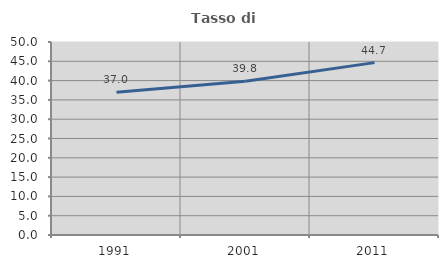
| Category | Tasso di occupazione   |
|---|---|
| 1991.0 | 37.008 |
| 2001.0 | 39.831 |
| 2011.0 | 44.66 |